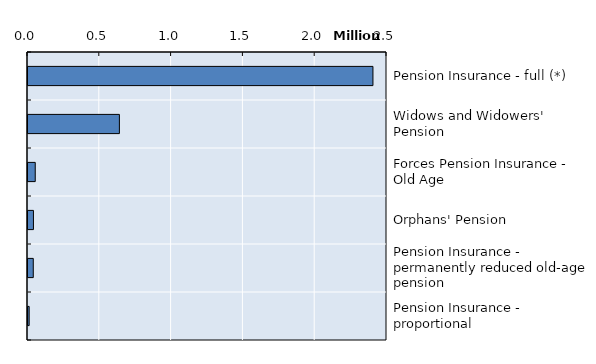
| Category | Series 0 |
|---|---|
| Pension Insurance - full (*) | 2402119 |
| Widows and Widowers' Pension  | 636468 |
| Forces Pension Insurance - Old Age | 50424 |
| Orphans' Pension | 37967 |
| Pension Insurance - permanently reduced old-age pension | 36763 |
| Pension Insurance - proportional | 7961 |